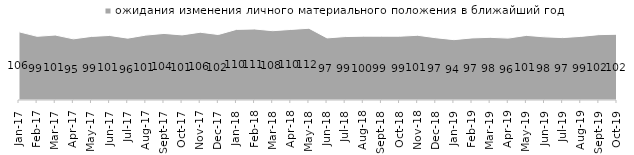
| Category | ожидания изменения личного материального положения в ближайший год |
|---|---|
| 2017-01-01 | 106.3 |
| 2017-02-01 | 99.25 |
| 2017-03-01 | 101.25 |
| 2017-04-01 | 95.3 |
| 2017-05-01 | 99.1 |
| 2017-06-01 | 100.6 |
| 2017-07-01 | 96.4 |
| 2017-08-01 | 101.15 |
| 2017-09-01 | 103.75 |
| 2017-10-01 | 101.45 |
| 2017-11-01 | 105.6 |
| 2017-12-01 | 102.05 |
| 2018-01-01 | 110.05 |
| 2018-02-01 | 110.65 |
| 2018-03-01 | 108 |
| 2018-04-01 | 109.95 |
| 2018-05-01 | 111.8 |
| 2018-06-01 | 96.75 |
| 2018-07-01 | 98.85 |
| 2018-08-01 | 99.5 |
| 2018-09-01 | 99.45 |
| 2018-10-01 | 99.4 |
| 2018-11-01 | 100.848 |
| 2018-12-01 | 97.05 |
| 2019-01-01 | 94.05 |
| 2019-02-01 | 96.75 |
| 2019-03-01 | 97.663 |
| 2019-04-01 | 96.436 |
| 2019-05-01 | 100.693 |
| 2019-06-01 | 98.404 |
| 2019-07-01 | 97.228 |
| 2019-08-01 | 99.151 |
| 2019-09-01 | 101.881 |
| 2019-10-01 | 102.475 |